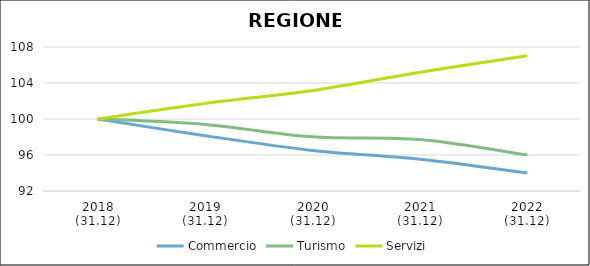
| Category | Commercio | Turismo | Servizi |
|---|---|---|---|
| 2018
(31.12) | 100 | 100 | 100 |
| 2019
(31.12) | 98.148 | 99.396 | 101.723 |
| 2020
(31.12) | 96.509 | 98.021 | 103.173 |
| 2021
(31.12) | 95.524 | 97.718 | 105.199 |
| 2022
(31.12) | 94.006 | 95.988 | 107.037 |